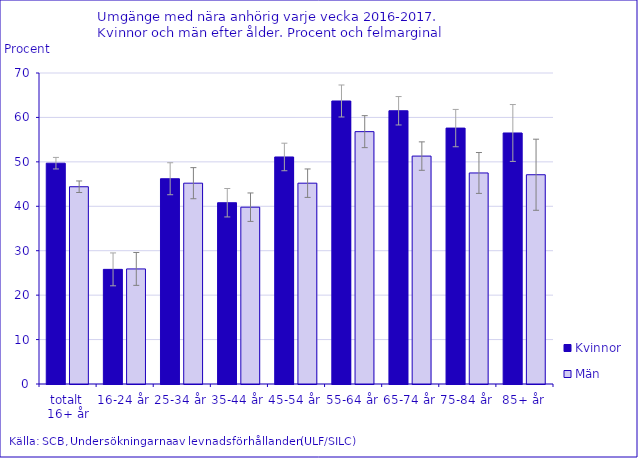
| Category | Kvinnor | Män |
|---|---|---|
| totalt 
16+ år | 49.7 | 44.4 |
| 16-24 år | 25.8 | 25.9 |
| 25-34 år | 46.2 | 45.2 |
| 35-44 år | 40.8 | 39.8 |
| 45-54 år | 51.1 | 45.2 |
| 55-64 år | 63.7 | 56.8 |
| 65-74 år | 61.5 | 51.3 |
| 75-84 år | 57.6 | 47.5 |
| 85+ år | 56.5 | 47.1 |